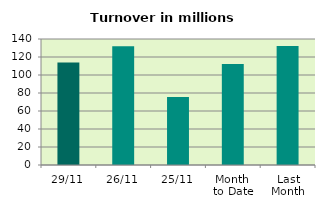
| Category | Series 0 |
|---|---|
| 29/11 | 113.768 |
| 26/11 | 132.033 |
| 25/11 | 75.673 |
| Month 
to Date | 112.207 |
| Last
Month | 132.268 |